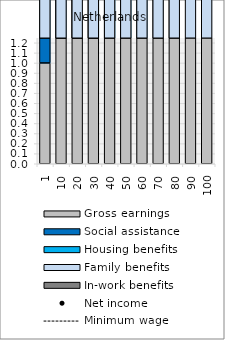
| Category | Gross earnings | Social assistance | Housing benefits | Family benefits | In-work benefits |
|---|---|---|---|---|---|
| 1.0 | 1 | 27.531 | 7.517 | 7.039 | 0 |
| 10.0 | 10 | 19.736 | 7.517 | 7.039 | 0 |
| 20.0 | 20 | 11.076 | 7.517 | 7.039 | 0 |
| 30.0 | 30.001 | 4.069 | 7.517 | 7.039 | 0 |
| 40.0 | 40.001 | 0 | 7.517 | 7.029 | 0 |
| 50.0 | 49.999 | 0 | 7.517 | 6.401 | 0 |
| 60.0 | 59.999 | 0 | 7.517 | 5.773 | 0 |
| 70.0 | 69.999 | 0 | 6.039 | 5.145 | 0 |
| 80.0 | 80 | 0 | 3.349 | 4.517 | 0 |
| 90.0 | 90 | 0 | 0 | 3.889 | 0 |
| 100.0 | 100 | 0 | 0 | 3.393 | 0 |